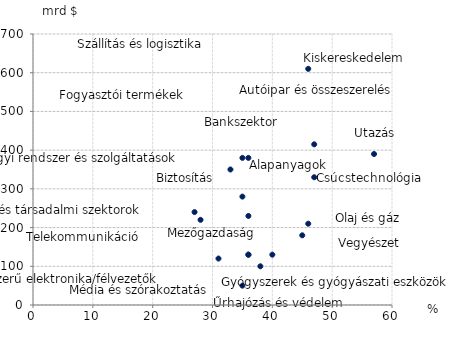
| Category | Series 0 |
|---|---|
| 46.0 | 610 |
| 35.0 | 380 |
| 36.0 | 380 |
| 47.0 | 415 |
| 57.0 | 390 |
| 33.0 | 350 |
| 47.0 | 330 |
| 27.0 | 240 |
| 28.0 | 220 |
| 35.0 | 280 |
| 36.0 | 230 |
| 46.0 | 210 |
| 31.0 | 120 |
| 36.0 | 130 |
| 40.0 | 130 |
| 45.0 | 180 |
| 38.0 | 100 |
| 35.0 | 50 |
| 36.0 | 130 |